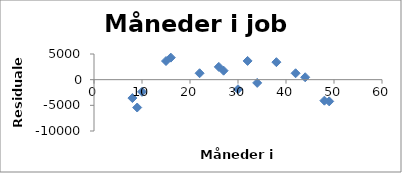
| Category | Series 0 |
|---|---|
| 8.0 | -3586.642 |
| 9.0 | -5426.747 |
| 10.0 | -2366.851 |
| 15.0 | 3632.625 |
| 16.0 | 4292.52 |
| 22.0 | 1251.892 |
| 27.0 | 1751.368 |
| 26.0 | 2491.473 |
| 30.0 | -1868.946 |
| 34.0 | -629.365 |
| 32.0 | 3650.844 |
| 38.0 | 3410.216 |
| 42.0 | 1249.797 |
| 44.0 | 469.587 |
| 48.0 | -4090.832 |
| 49.0 | -4230.937 |